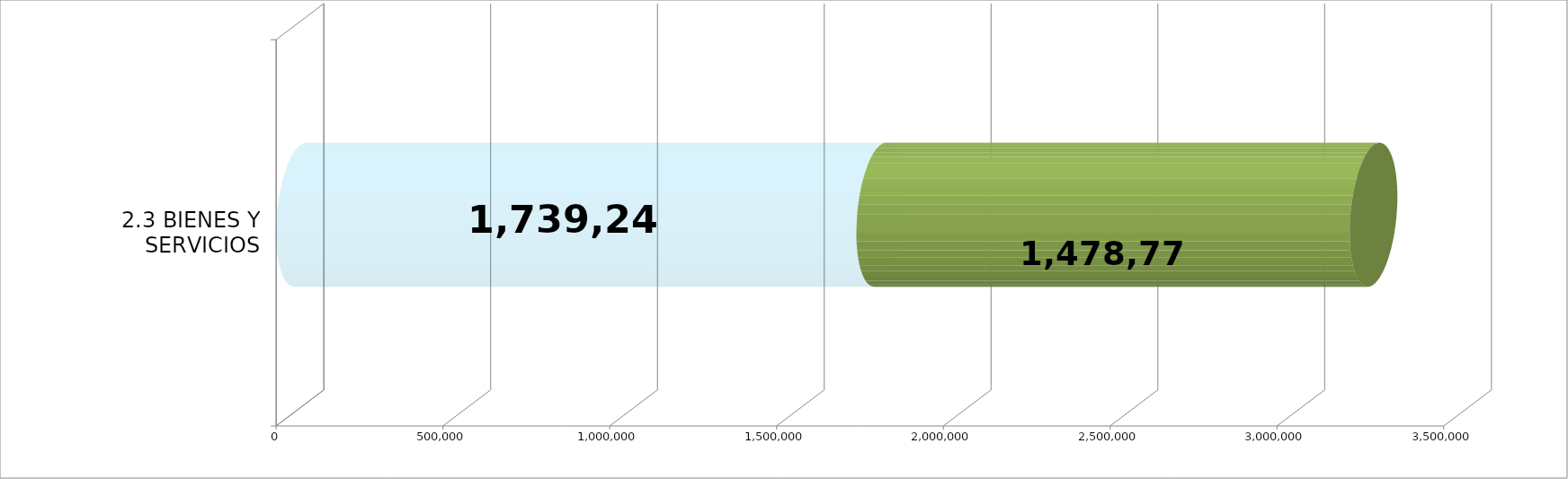
| Category | EJECUTADO | SALDO  |
|---|---|---|
| 2.3 BIENES Y SERVICIOS | 1739241.19 | 1478769.81 |